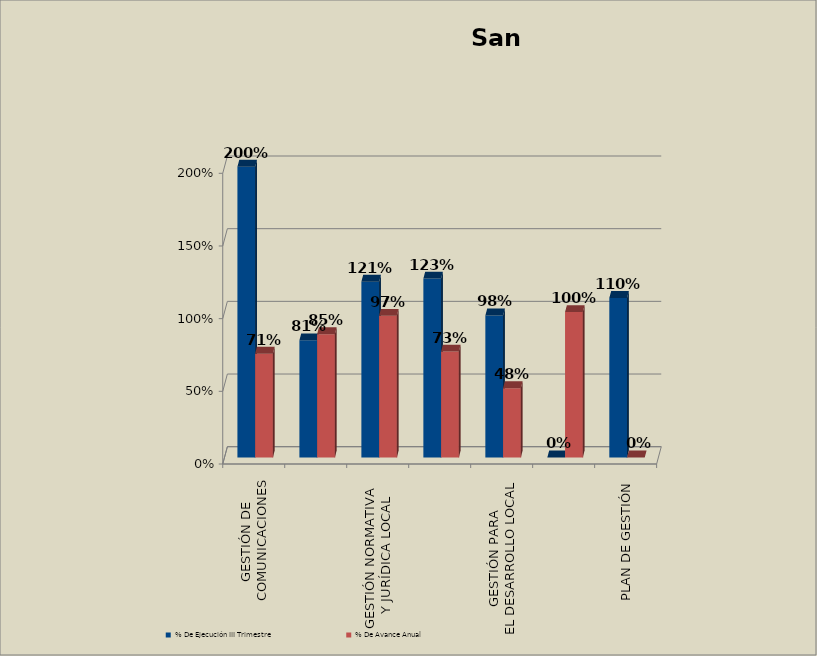
| Category | % De Ejecución III Trimestre | % De Avance Anual |
|---|---|---|
| GESTIÓN DE 
COMUNICACIONES | 2 | 0.714 |
| GESTIÓN Y ADQUISICIÓN
 DE RECURSOS | 0.806 | 0.848 |
| GESTIÓN NORMATIVA 
Y JURÍDICA LOCAL | 1.209 | 0.974 |
| GESTIÓN PARA LA
CONVIVENCIA Y SEGURIDAD
INTEGRAL | 1.231 | 0.729 |
| GESTIÓN PARA 
EL DESARROLLO LOCAL | 0.977 | 0.476 |
| AGENCIAMIENTO DE LA 
POLÍTICA PÚBLICA | 0 | 1 |
| PLAN DE GESTIÓN | 1.097 | 0 |